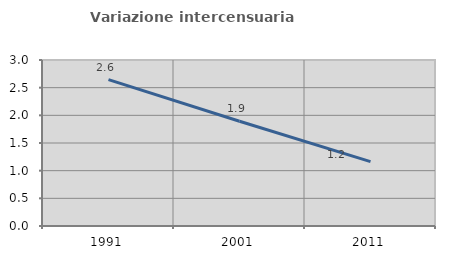
| Category | Variazione intercensuaria annua |
|---|---|
| 1991.0 | 2.645 |
| 2001.0 | 1.892 |
| 2011.0 | 1.163 |